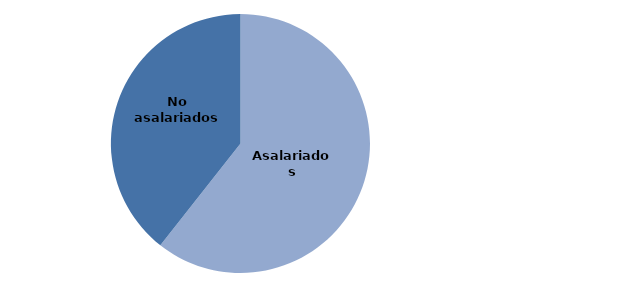
| Category | Series 0 |
|---|---|
| Asalariados | 60.625 |
| No asalariados | 39.375 |